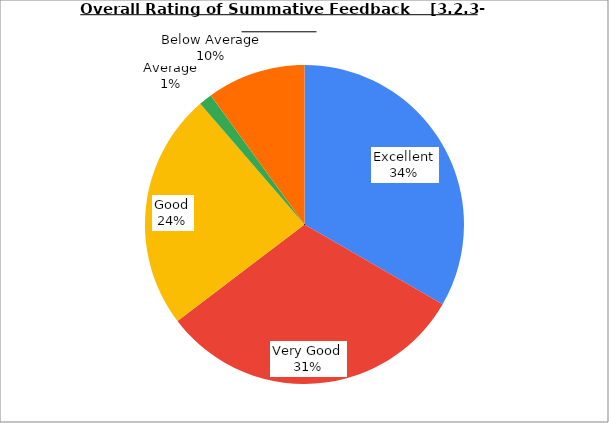
| Category | Series 0 |
|---|---|
| Excellent | 33.333 |
| Very Good | 31.333 |
| Good | 24 |
| Average | 1.333 |
| Below Average | 10 |